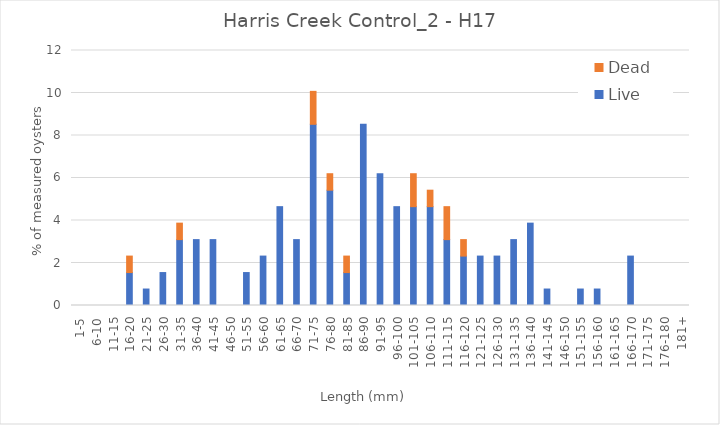
| Category | Live | Dead |
|---|---|---|
| 1-5 | 0 | 0 |
| 6-10 | 0 | 0 |
| 11-15 | 0 | 0 |
| 16-20 | 1.55 | 0.775 |
| 21-25 | 0.775 | 0 |
| 26-30 | 1.55 | 0 |
| 31-35 | 3.101 | 0.775 |
| 36-40 | 3.101 | 0 |
| 41-45 | 3.101 | 0 |
| 46-50 | 0 | 0 |
| 51-55 | 1.55 | 0 |
| 56-60 | 2.326 | 0 |
| 61-65 | 4.651 | 0 |
| 66-70 | 3.101 | 0 |
| 71-75 | 8.527 | 1.55 |
| 76-80 | 5.426 | 0.775 |
| 81-85 | 1.55 | 0.775 |
| 86-90 | 8.527 | 0 |
| 91-95 | 6.202 | 0 |
| 96-100 | 4.651 | 0 |
| 101-105 | 4.651 | 1.55 |
| 106-110 | 4.651 | 0.775 |
| 111-115 | 3.101 | 1.55 |
| 116-120 | 2.326 | 0.775 |
| 121-125 | 2.326 | 0 |
| 126-130 | 2.326 | 0 |
| 131-135 | 3.101 | 0 |
| 136-140 | 3.876 | 0 |
| 141-145 | 0.775 | 0 |
| 146-150 | 0 | 0 |
| 151-155 | 0.775 | 0 |
| 156-160 | 0.775 | 0 |
| 161-165 | 0 | 0 |
| 166-170 | 2.326 | 0 |
| 171-175 | 0 | 0 |
| 176-180 | 0 | 0 |
| 181+ | 0 | 0 |